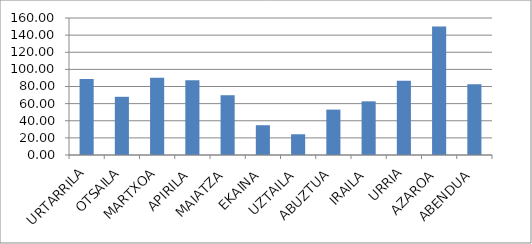
| Category | Series 0 |
|---|---|
| URTARRILA | 88.75 |
| OTSAILA | 67.967 |
| MARTXOA | 90.2 |
| APIRILA | 87.383 |
| MAIATZA | 69.817 |
| EKAINA | 34.783 |
| UZTAILA | 24.217 |
| ABUZTUA | 53.017 |
| IRAILA | 62.667 |
| URRIA | 86.8 |
| AZAROA | 150.217 |
| ABENDUA | 82.65 |